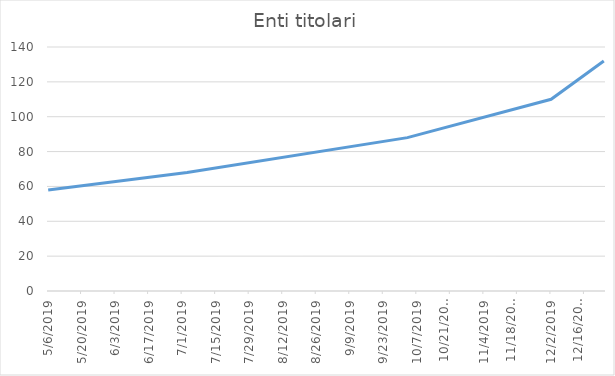
| Category | Enti titolari |
|---|---|
| 5/6/19 | 58 |
| 7/3/19 | 68 |
| 10/3/19 | 88 |
| 12/2/19 | 110 |
| 12/24/19 | 132 |